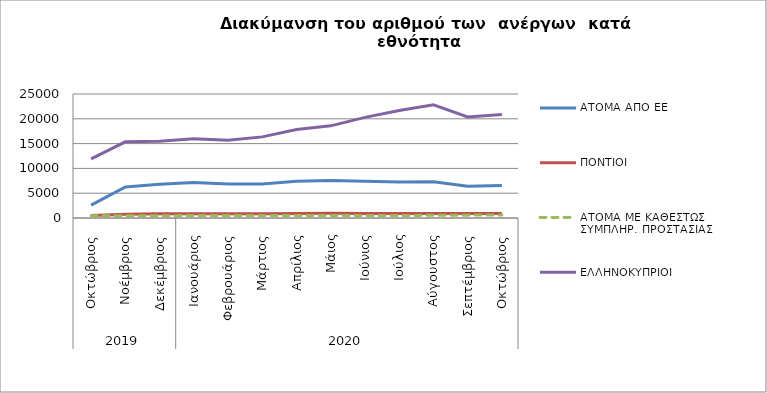
| Category | ΑΤΟΜΑ ΑΠΟ ΕΕ | ΠΟΝΤΙΟΙ | ΑΤΟΜΑ ΜΕ ΚΑΘΕΣΤΩΣ ΣΥΜΠΛΗΡ. ΠΡΟΣΤΑΣΙΑΣ | ΕΛΛΗΝΟΚΥΠΡΙΟΙ |
|---|---|---|---|---|
| 0 | 2586 | 518 | 475 | 11921 |
| 1 | 6266 | 775 | 476 | 15352 |
| 2 | 6810 | 834 | 465 | 15490 |
| 3 | 7137 | 866 | 490 | 15998 |
| 4 | 6870 | 843 | 480 | 15686 |
| 5 | 6874 | 847 | 504 | 16354 |
| 6 | 7404 | 915 | 519 | 17832 |
| 7 | 7574 | 936 | 521 | 18581 |
| 8 | 7420 | 925 | 510 | 20290 |
| 9 | 7235 | 885 | 503 | 21691 |
| 10 | 7285 | 905 | 547 | 22821 |
| 11 | 6392 | 883 | 579 | 20370 |
| 12 | 6536 | 911 | 609 | 20863 |